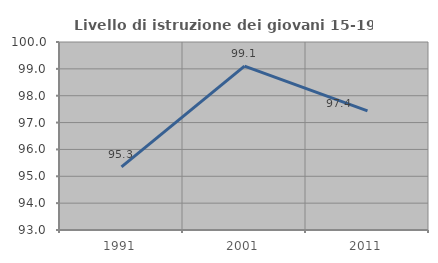
| Category | Livello di istruzione dei giovani 15-19 anni |
|---|---|
| 1991.0 | 95.349 |
| 2001.0 | 99.099 |
| 2011.0 | 97.436 |